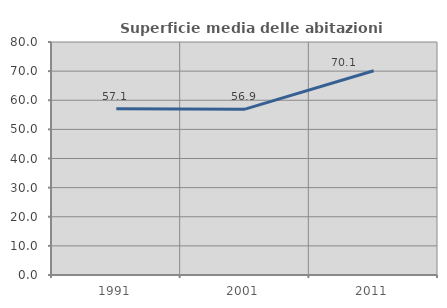
| Category | Superficie media delle abitazioni occupate |
|---|---|
| 1991.0 | 57.098 |
| 2001.0 | 56.945 |
| 2011.0 | 70.145 |